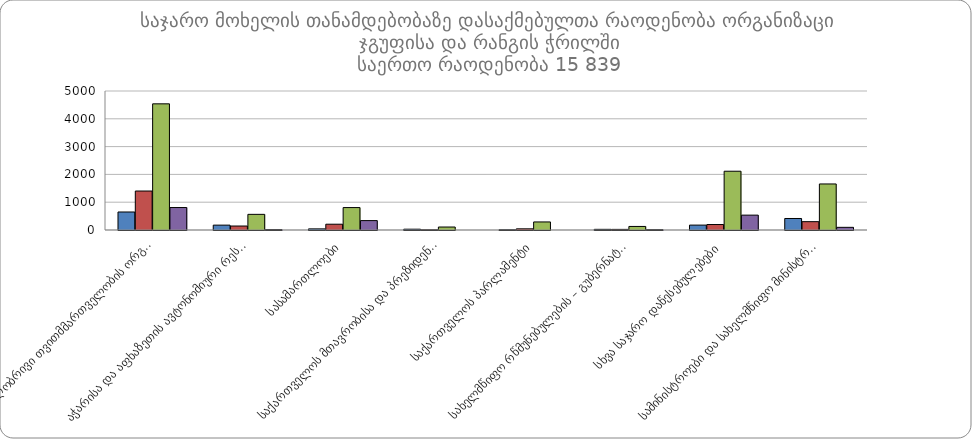
| Category |  პირველი რანგი |  მეორე რანგი |  მესამე რანგი |  მეოთხე რანგი |
|---|---|---|---|---|
|  ადგილობრივი თვითმმართველობის ორგანოები | 648 | 1402 | 4538 | 808 |
|  აჭარისა და აფხაზეთის ავტონომიური რესპუბლიკები | 175 | 143 | 563 | 13 |
|  სასამართლოები | 40 | 208 | 807 | 338 |
|  საქართველოს მთავრობისა და პრეზიდენტის ადმინისტრაციებინისტრაცია | 29 | 7 | 107 | 0 |
|  საქართველოს პარლამენტი | 8 | 42 | 290 | 0 |
|  სახელმწიფო რწმუნებულების – გუბერნატორების ადმინისტრაციები | 24 | 22 | 128 | 11 |
|  სხვა საჯარო დაწესებულებები | 176 | 197 | 2114 | 535 |
|  სამინისტროები და სახელმწიფო მინისტრების აპარატი | 414 | 300 | 1656 | 96 |